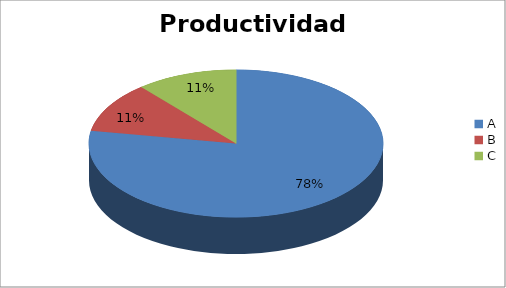
| Category | Series 0 |
|---|---|
| A | 77.778 |
| B | 11.111 |
| C | 11.111 |